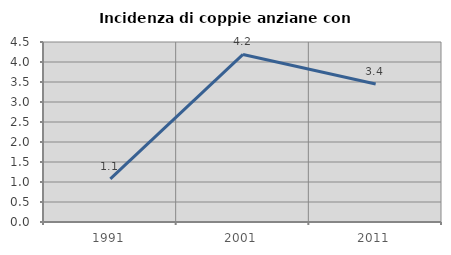
| Category | Incidenza di coppie anziane con figli |
|---|---|
| 1991.0 | 1.078 |
| 2001.0 | 4.188 |
| 2011.0 | 3.448 |